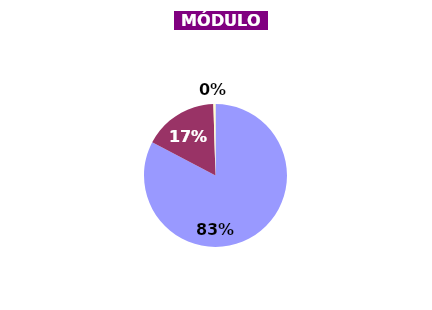
| Category | Series 0 |
|---|---|
| ÓTIMO | 82.7 |
| BOM | 16.825 |
| REGULAR | 0.475 |